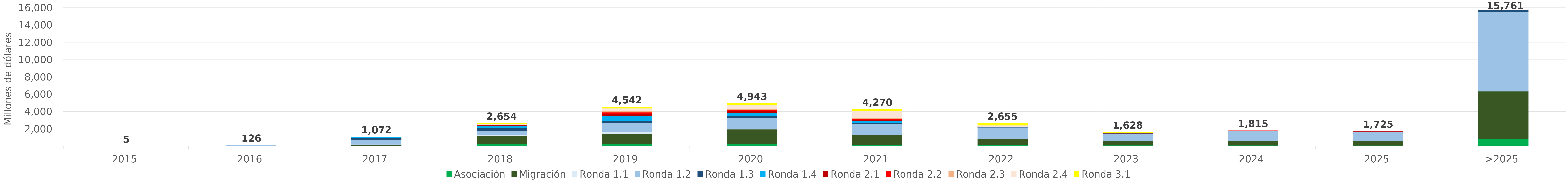
| Category | Asociación | Migración | Ronda 1.1 | Ronda 1.2 | Ronda 1.3 | Ronda 1.4 | Ronda 2.1 | Ronda 2.2 | Ronda 2.3 | Ronda 2.4 | Ronda 3.1 |
|---|---|---|---|---|---|---|---|---|---|---|---|
| 2015 | 0 | 0 | 4.573 | 0.236 | 0 | 0 | 0 | 0 | 0 | 0 | 0 |
| 2016 | 0 | 0 | 16.79 | 108.909 | 0 | 0 | 0 | 0 | 0 | 0 | 0 |
| 2017 | 50.877 | 65.422 | 76.429 | 533.486 | 231.789 | 93.443 | 18.851 | 1.29 | 0.72 | 0 | 0 |
| 2018 | 289.394 | 902.921 | 155.042 | 470.128 | 278.302 | 226.903 | 104.896 | 21.902 | 26.974 | 139.641 | 37.691 |
| 2019 | 241.207 | 1195.818 | 236.68 | 1049.68 | 207.126 | 540.649 | 302.09 | 133.009 | 199.161 | 270.262 | 166.186 |
| 2020 | 284.321 | 1655.641 | 6.736 | 1382.287 | 161.213 | 341.057 | 252.645 | 70.216 | 163.112 | 477.469 | 148.013 |
| 2021 | 118.804 | 1192.243 | 2.229 | 1293.069 | 92.463 | 274.593 | 98.126 | 92.88 | 65.832 | 800.988 | 238.674 |
| 2022 | 112.591 | 689.457 | 0 | 1363.556 | 44.141 | 10.69 | 22.683 | 30.043 | 0 | 134.16 | 247.297 |
| 2023 | 87.085 | 555.219 | 0 | 815.124 | 38.135 | 0.73 | 0.019 | 36.282 | 0 | 33.183 | 62.088 |
| 2024 | 79.455 | 553.791 | 0 | 1120.717 | 33.996 | 0 | 0 | 26.685 | 0 | 0 | 0 |
| 2025 | 75.288 | 530.69 | 0 | 1074.435 | 35.345 | 0 | 0 | 9.414 | 0 | 0 | 0 |
| >2025 | 859.226 | 5485.433 | 0 | 9146.402 | 249.076 | 0 | 0 | 21.146 | 0 | 0 | 0 |